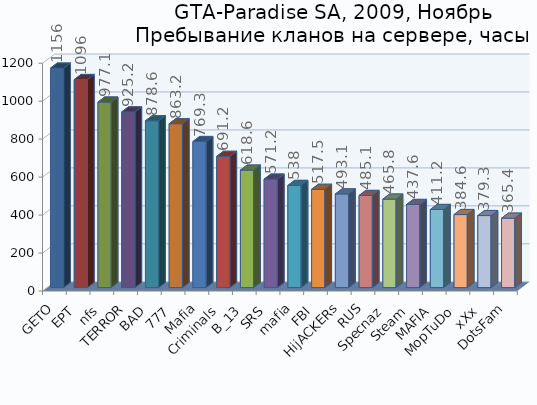
| Category | Series 0 |
|---|---|
| GETO | 1156 |
| EPT | 1096 |
| nfs | 977.1 |
| TERROR | 925.2 |
| BAD | 878.6 |
| 777 | 863.2 |
| Mafia | 769.3 |
| Criminals | 691.2 |
| B_13 | 618.6 |
| SRS | 571.2 |
| mafia | 538 |
| FBI | 517.5 |
| HijACKERs | 493.1 |
| RUS | 485.1 |
| Specnaz | 465.8 |
| Steam | 437.6 |
| MAFIA | 411.2 |
| MopTuDo | 384.6 |
| xXx | 379.3 |
| DotsFam | 365.4 |